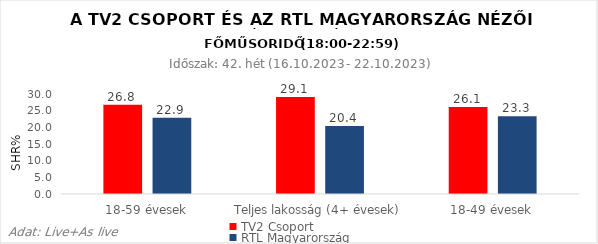
| Category | TV2 Csoport | RTL Magyarország |
|---|---|---|
| 18-59 évesek | 26.8 | 22.9 |
| Teljes lakosság (4+ évesek) | 29.1 | 20.4 |
| 18-49 évesek | 26.1 | 23.3 |